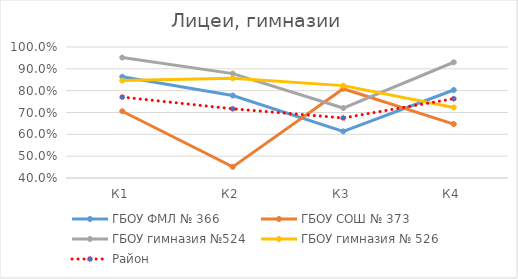
| Category | ГБОУ ФМЛ № 366 | ГБОУ СОШ № 373 | ГБОУ гимназия №524 | ГБОУ гимназия № 526 | Район |
|---|---|---|---|---|---|
| К1 | 0.864 | 0.706 | 0.952 | 0.846 | 0.771 |
| К2 | 0.778 | 0.451 | 0.878 | 0.856 | 0.717 |
| К3 | 0.614 | 0.809 | 0.72 | 0.823 | 0.675 |
| К4 | 0.803 | 0.647 | 0.93 | 0.723 | 0.763 |